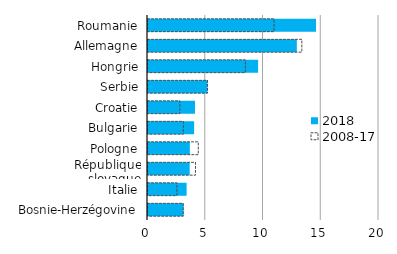
| Category | 2018 | 2008-17 |
|---|---|---|
| Roumanie | 14.547 | 10.911 |
| Allemagne | 12.887 | 13.319 |
| Hongrie | 9.531 | 8.429 |
| Serbie | 5.146 | 5.148 |
| Croatie | 4.069 | 2.759 |
| Bulgarie | 3.994 | 3.064 |
| Pologne | 3.623 | 4.353 |
| République slovaque | 3.609 | 4.109 |
| Italie | 3.344 | 2.505 |
| Bosnie-Herzégovine | 3.082 | 3.047 |